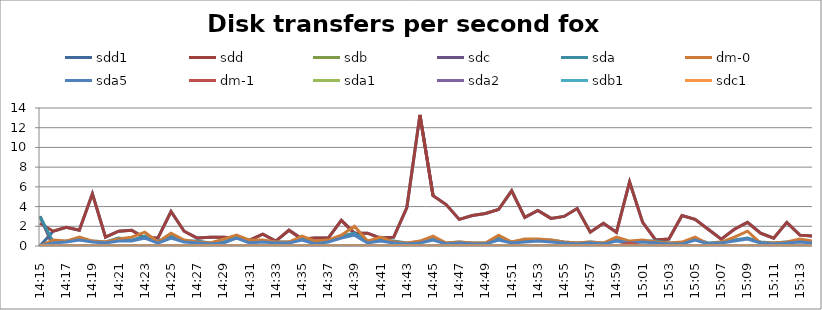
| Category | sdd1 | sdd | sdb | sdc | sda | dm-0 | sda5 | dm-1 | sda1 | sda2 | sdb1 | sdc1 |
|---|---|---|---|---|---|---|---|---|---|---|---|---|
| 14:15 | 0 | 2.3 | 3 | 3 | 3 | 0 | 0 | 0 | 0 | 0 | 0 | 0 |
| 14:16 | 1.5 | 1.5 | 0 | 0 | 0.4 | 0.6 | 0.3 | 0 | 0 | 0 | 0 | 0 |
| 14:17 | 1.9 | 1.9 | 0 | 0 | 0.5 | 0.5 | 0.4 | 0 | 0 | 0 | 0 | 0 |
| 14:18 | 1.6 | 1.6 | 0 | 0 | 0.7 | 0.9 | 0.6 | 0 | 0 | 0 | 0 | 0 |
| 14:19 | 5.3 | 5.3 | 0 | 0 | 0.5 | 0.5 | 0.4 | 0 | 0 | 0 | 0 | 0 |
| 14:20 | 0.9 | 0.9 | 0 | 0 | 0.4 | 0.4 | 0.3 | 0 | 0 | 0 | 0 | 0 |
| 14:21 | 1.5 | 1.5 | 0 | 0 | 0.8 | 0.7 | 0.5 | 0 | 0 | 0 | 0 | 0 |
| 14:22 | 1.6 | 1.6 | 0 | 0 | 0.6 | 0.9 | 0.5 | 0 | 0 | 0 | 0 | 0 |
| 14:23 | 0.8 | 0.8 | 0 | 0 | 1 | 1.4 | 0.8 | 0 | 0 | 0 | 0 | 0 |
| 14:24 | 0.8 | 0.8 | 0 | 0 | 0.5 | 0.4 | 0.3 | 0 | 0 | 0 | 0 | 0 |
| 14:25 | 3.5 | 3.5 | 0 | 0 | 1 | 1.3 | 0.8 | 0 | 0 | 0 | 0 | 0 |
| 14:26 | 1.5 | 1.5 | 0 | 0 | 0.5 | 0.6 | 0.4 | 0 | 0 | 0 | 0 | 0 |
| 14:27 | 0.8 | 0.8 | 0 | 0 | 0.5 | 0.4 | 0.3 | 0 | 0 | 0 | 0 | 0 |
| 14:28 | 0.9 | 0.9 | 0 | 0 | 0.3 | 0.3 | 0.2 | 0 | 0 | 0 | 0 | 0 |
| 14:29 | 0.9 | 0.9 | 0 | 0 | 0.4 | 0.7 | 0.3 | 0 | 0 | 0 | 0 | 0 |
| 14:30 | 0.8 | 0.8 | 0 | 0 | 0.9 | 1.1 | 0.8 | 0 | 0 | 0 | 0 | 0 |
| 14:31 | 0.6 | 0.6 | 0 | 0 | 0.4 | 0.6 | 0.3 | 0 | 0 | 0 | 0 | 0 |
| 14:32 | 1.2 | 1.2 | 0 | 0 | 0.5 | 0.6 | 0.4 | 0 | 0 | 0 | 0 | 0 |
| 14:33 | 0.5 | 0.5 | 0 | 0 | 0.4 | 0.4 | 0.3 | 0 | 0 | 0 | 0 | 0 |
| 14:34 | 1.6 | 1.6 | 0 | 0 | 0.4 | 0.4 | 0.3 | 0 | 0 | 0 | 0 | 0 |
| 14:35 | 0.7 | 0.7 | 0 | 0 | 0.7 | 1 | 0.6 | 0 | 0 | 0 | 0 | 0 |
| 14:36 | 0.8 | 0.8 | 0 | 0 | 0.3 | 0.5 | 0.2 | 0 | 0 | 0 | 0 | 0 |
| 14:37 | 0.8 | 0.8 | 0 | 0 | 0.5 | 0.6 | 0.4 | 0 | 0 | 0 | 0 | 0 |
| 14:38 | 2.6 | 2.6 | 0 | 0 | 1 | 1.1 | 0.8 | 0 | 0 | 0 | 0 | 0 |
| 14:39 | 1.3 | 1.3 | 0 | 0 | 1.3 | 2 | 1.1 | 0 | 0 | 0 | 0 | 0 |
| 14:40 | 1.3 | 1.3 | 0 | 0 | 0.5 | 0.5 | 0.3 | 0 | 0 | 0 | 0 | 0 |
| 14:41 | 0.8 | 0.8 | 0 | 0 | 0.6 | 0.9 | 0.5 | 0 | 0 | 0 | 0 | 0 |
| 14:42 | 0.9 | 0.9 | 0 | 0 | 0.5 | 0.4 | 0.3 | 0 | 0 | 0 | 0 | 0 |
| 14:43 | 3.9 | 3.9 | 0 | 0 | 0.3 | 0.3 | 0.2 | 0 | 0 | 0 | 0 | 0 |
| 14:44 | 13.3 | 13.3 | 0 | 0 | 0.4 | 0.5 | 0.3 | 0 | 0 | 0 | 0 | 0 |
| 14:45 | 5.1 | 5.1 | 0 | 0 | 0.8 | 1 | 0.6 | 0 | 0 | 0 | 0 | 0 |
| 14:46 | 4.2 | 4.2 | 0 | 0 | 0.3 | 0.3 | 0.2 | 0 | 0 | 0 | 0 | 0 |
| 14:47 | 2.7 | 2.7 | 0 | 0 | 0.4 | 0.4 | 0.3 | 0 | 0 | 0 | 0 | 0 |
| 14:48 | 3.1 | 3.1 | 0 | 0 | 0.3 | 0.3 | 0.2 | 0 | 0 | 0 | 0 | 0 |
| 14:49 | 3.3 | 3.3 | 0 | 0 | 0.3 | 0.3 | 0.2 | 0 | 0 | 0 | 0 | 0 |
| 14:50 | 3.7 | 3.7 | 0 | 0 | 0.8 | 1.1 | 0.6 | 0 | 0 | 0 | 0 | 0 |
| 14:51 | 5.6 | 5.6 | 0 | 0 | 0.4 | 0.4 | 0.3 | 0 | 0 | 0 | 0 | 0 |
| 14:52 | 2.9 | 2.9 | 0 | 0 | 0.6 | 0.7 | 0.4 | 0 | 0 | 0 | 0 | 0 |
| 14:53 | 3.6 | 3.6 | 0 | 0 | 0.6 | 0.7 | 0.5 | 0 | 0 | 0 | 0 | 0 |
| 14:54 | 2.8 | 2.8 | 0 | 0 | 0.6 | 0.6 | 0.4 | 0 | 0 | 0 | 0 | 0 |
| 14:55 | 3 | 3 | 0 | 0 | 0.4 | 0.4 | 0.3 | 0 | 0 | 0 | 0 | 0 |
| 14:56 | 3.8 | 3.8 | 0 | 0 | 0.3 | 0.3 | 0.2 | 0 | 0 | 0 | 0 | 0 |
| 14:57 | 1.4 | 1.4 | 0 | 0 | 0.4 | 0.4 | 0.3 | 0 | 0 | 0 | 0 | 0 |
| 14:58 | 2.3 | 2.3 | 0 | 0 | 0.3 | 0.3 | 0.2 | 0 | 0 | 0 | 0 | 0 |
| 14:59 | 1.4 | 1.4 | 0 | 0 | 0.6 | 0.9 | 0.5 | 0 | 0 | 0 | 0 | 0 |
| 15:00 | 6.5 | 6.5 | 0 | 0 | 0.4 | 0.5 | 0.3 | 0.3 | 0 | 0 | 0 | 0 |
| 15:01 | 2.4 | 2.4 | 0 | 0 | 0.5 | 0.6 | 0.4 | 0 | 0 | 0 | 0 | 0 |
| 15:02 | 0.6 | 0.6 | 0 | 0 | 0.5 | 0.4 | 0.3 | 0 | 0 | 0 | 0 | 0 |
| 15:03 | 0.7 | 0.7 | 0 | 0 | 0.3 | 0.3 | 0.2 | 0 | 0 | 0 | 0 | 0 |
| 15:04 | 3.1 | 3.1 | 0 | 0 | 0.3 | 0.4 | 0.2 | 0 | 0 | 0 | 0 | 0 |
| 15:05 | 2.7 | 2.7 | 0 | 0 | 0.7 | 0.9 | 0.6 | 0 | 0 | 0 | 0 | 0 |
| 15:06 | 1.7 | 1.7 | 0 | 0 | 0.3 | 0.2 | 0.2 | 0 | 0 | 0 | 0 | 0 |
| 15:07 | 0.7 | 0.7 | 0 | 0 | 0.4 | 0.4 | 0.3 | 0 | 0 | 0 | 0 | 0 |
| 15:08 | 1.7 | 1.7 | 0 | 0 | 0.6 | 0.9 | 0.5 | 0 | 0 | 0 | 0 | 0 |
| 15:09 | 2.4 | 2.4 | 0 | 0 | 0.8 | 1.5 | 0.7 | 0 | 0 | 0 | 0 | 0 |
| 15:10 | 1.3 | 1.3 | 0 | 0 | 0.4 | 0.3 | 0.3 | 0 | 0 | 0 | 0 | 0 |
| 15:11 | 0.8 | 0.8 | 0 | 0 | 0.3 | 0.3 | 0.2 | 0 | 0 | 0 | 0 | 0 |
| 15:12 | 2.4 | 2.4 | 0 | 0 | 0.4 | 0.4 | 0.3 | 0 | 0 | 0 | 0 | 0 |
| 15:13 | 1.1 | 1.1 | 0 | 0 | 0.5 | 0.7 | 0.4 | 0 | 0 | 0 | 0 | 0 |
| 15:14 | 1 | 1 | 0 | 0 | 0.4 | 0.5 | 0.3 | 0 | 0 | 0 | 0 | 0 |